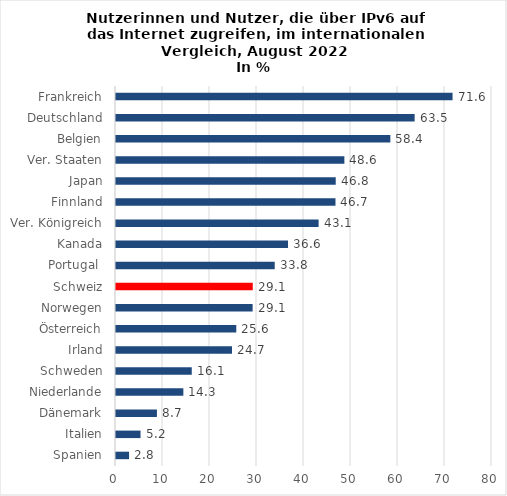
| Category | % |
|---|---|
| Spanien | 2.78 |
| Italien | 5.22 |
| Dänemark | 8.71 |
| Niederlande | 14.33 |
| Schweden | 16.12 |
| Irland | 24.68 |
| Österreich | 25.59 |
| Norwegen | 29.07 |
| Schweiz | 29.1 |
| Portugal  | 33.77 |
| Kanada | 36.6 |
| Ver. Königreich | 43.11 |
| Finnland | 46.7 |
| Japan | 46.75 |
| Ver. Staaten | 48.59 |
| Belgien | 58.37 |
| Deutschland | 63.54 |
| Frankreich | 71.61 |